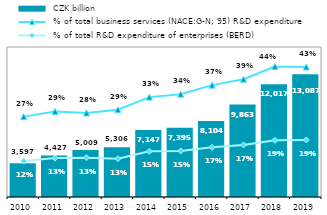
| Category |  CZK billion |
|---|---|
| 2010.0 | 3597.172 |
| 2011.0 | 4426.887 |
| 2012.0 | 5009.133 |
| 2013.0 | 5305.793 |
| 2014.0 | 7146.732 |
| 2015.0 | 7394.736 |
| 2016.0 | 8103.91 |
| 2017.0 | 9863.017 |
| 2018.0 | 12016.964 |
| 2019.0 | 13086.503 |